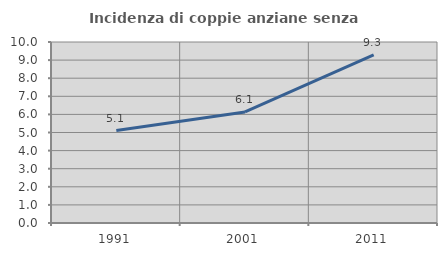
| Category | Incidenza di coppie anziane senza figli  |
|---|---|
| 1991.0 | 5.105 |
| 2001.0 | 6.135 |
| 2011.0 | 9.292 |